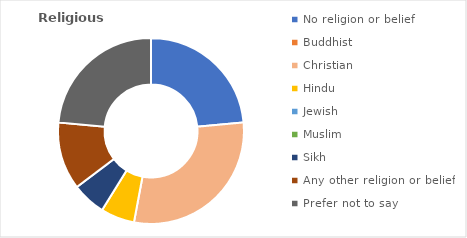
| Category | % |
|---|---|
| No religion or belief | 23.529 |
| Buddhist | 0 |
| Christian | 29.412 |
| Hindu | 5.882 |
| Jewish | 0 |
| Muslim | 0 |
| Sikh | 5.882 |
| Any other religion or belief | 11.765 |
| Prefer not to say | 23.529 |